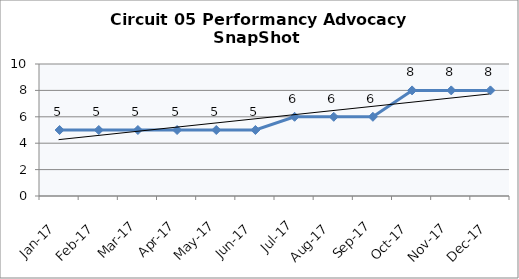
| Category | Circuit 05 |
|---|---|
| Jan-17 | 5 |
| Feb-17 | 5 |
| Mar-17 | 5 |
| Apr-17 | 5 |
| May-17 | 5 |
| Jun-17 | 5 |
| Jul-17 | 6 |
| Aug-17 | 6 |
| Sep-17 | 6 |
| Oct-17 | 8 |
| Nov-17 | 8 |
| Dec-17 | 8 |